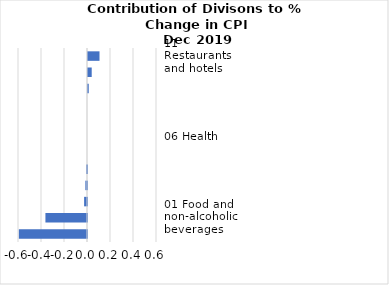
| Category |     Contributions |
|---|---|
| 11 Restaurants and hotels | 0.1 |
| 12 Miscellaneous goods and services | 0.032 |
| 03 Clothing and footwear | 0.006 |
| 09 Recreation and culture | 0 |
| 10 Education | 0 |
| 06 Health | 0 |
| 08 Communication | 0 |
| 04 Housing, water, electricity, gas and other fuels | -0.008 |
| 05 Furnishings, household equipment and routine household maintenance | -0.014 |
| 02 Alcoholic beverages, tobacco and narcotics | -0.025 |
| 01 Food and non-alcoholic beverages | -0.361 |
| 07 Transport | -0.593 |